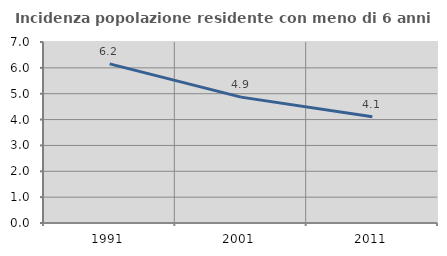
| Category | Incidenza popolazione residente con meno di 6 anni |
|---|---|
| 1991.0 | 6.153 |
| 2001.0 | 4.868 |
| 2011.0 | 4.107 |